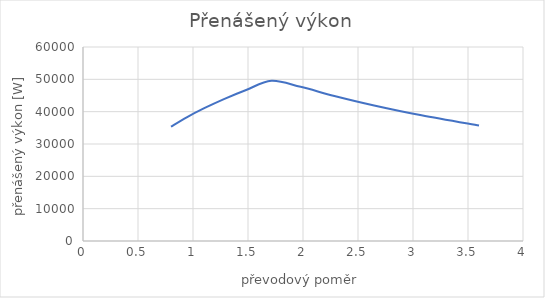
| Category | Series 0 |
|---|---|
| 0.7999999999999998 | 35345.987 |
| 0.9429522752497227 | 38245.319 |
| 1.1023474178403756 | 41071.787 |
| 1.281195516811955 | 43894.778 |
| 1.483289124668435 | 46714.719 |
| 1.7134751773049643 | 49531.956 |
| 1.9780487804878049 | 47687.652 |
| 2.285337726523888 | 44873.67 |
| 2.646594982078853 | 41937.146 |
| 3.0774066797642443 | 38879.205 |
| 3.6000000000000005 | 35697.649 |